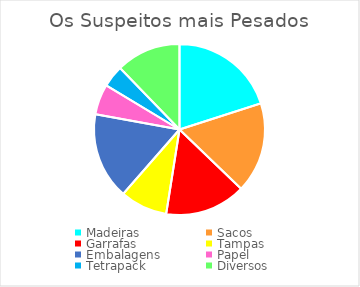
| Category | Series 0 |
|---|---|
| Madeiras | 20.052 |
| Sacos | 17.142 |
| Garrafas | 15.295 |
| Tampas | 8.956 |
| Embalagens | 16.421 |
| Papel | 5.742 |
| Tetrapack | 4.153 |
| Diversos | 12.238 |